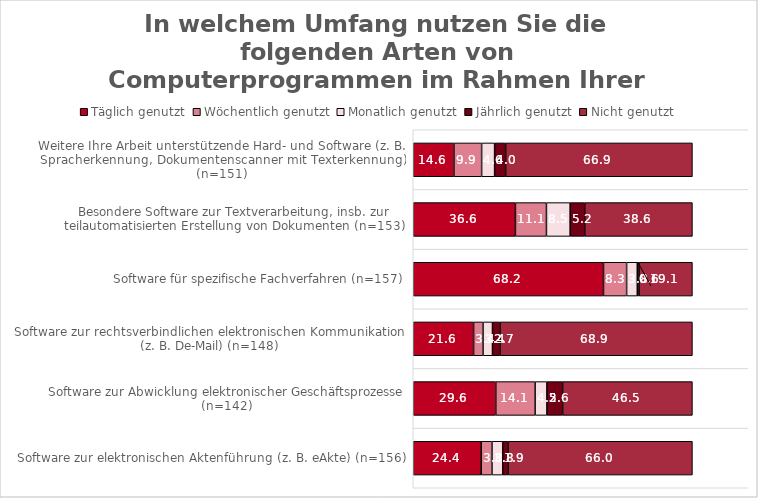
| Category | Täglich genutzt | Wöchentlich genutzt | Monatlich genutzt | Jährlich genutzt | Nicht genutzt |
|---|---|---|---|---|---|
| Software zur elektronischen Aktenführung (z. B. eAkte) (n=156) | 24.359 | 3.846 | 3.846 | 1.923 | 66.026 |
| Software zur Abwicklung elektronischer Geschäftsprozesse (n=142) | 29.577 | 14.085 | 4.225 | 5.634 | 46.479 |
| Software zur rechtsverbindlichen elektronischen Kommunikation (z. B. De-Mail) (n=148) | 21.622 | 3.378 | 3.378 | 2.703 | 68.919 |
| Software für spezifische Fachverfahren (n=157) | 68.153 | 8.28 | 3.822 | 0.637 | 19.108 |
| Besondere Software zur Textverarbeitung, insb. zur teilautomatisierten Erstellung von Dokumenten (n=153) | 36.601 | 11.111 | 8.497 | 5.229 | 38.562 |
| Weitere Ihre Arbeit unterstützende Hard- und Software (z. B. Spracherkennung, Dokumentenscanner mit Texterkennung) (n=151) | 14.57 | 9.934 | 4.636 | 3.974 | 66.887 |